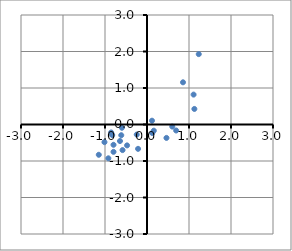
| Category | Series 0 |
|---|---|
| 0.46348561039872127 | -0.367 |
| -0.5820631391737655 | -0.701 |
| -0.21304593344229955 | -0.667 |
| -1.0125832125271423 | -0.483 |
| -0.7973231758504539 | -0.556 |
| -0.24379736725325504 | -0.275 |
| -0.9203289110942758 | -0.927 |
| -0.612814572984721 | -0.293 |
| 3.2311146533847155 | 3.662 |
| 0.6018670625480209 | -0.057 |
| 0.8571039631789515 | 1.156 |
| -0.5974388560792432 | -0.089 |
| -0.4744331208354212 | -0.572 |
| 0.16212155905135744 | -0.17 |
| 0.11906955171601975 | 0.104 |
| 1.12771658071536 | 0.426 |
| -0.6435660067956764 | -0.453 |
| -0.8526757567101738 | -0.218 |
| -1.1478895212953466 | -0.83 |
| 1.1092657204287866 | 0.819 |
| -0.8280746096614094 | -0.289 |
| 1.2322714556726087 | 1.928 |
| 0.12521983847821086 | -0.234 |
| 0.6941213639808874 | -0.165 |
| -0.7973231758504539 | -0.749 |